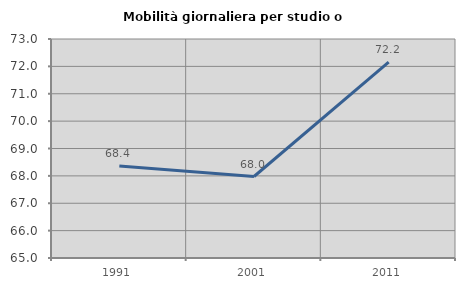
| Category | Mobilità giornaliera per studio o lavoro |
|---|---|
| 1991.0 | 68.357 |
| 2001.0 | 67.977 |
| 2011.0 | 72.152 |